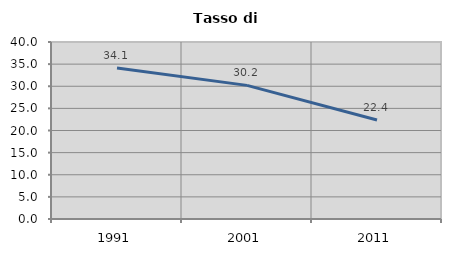
| Category | Tasso di disoccupazione   |
|---|---|
| 1991.0 | 34.101 |
| 2001.0 | 30.198 |
| 2011.0 | 22.38 |